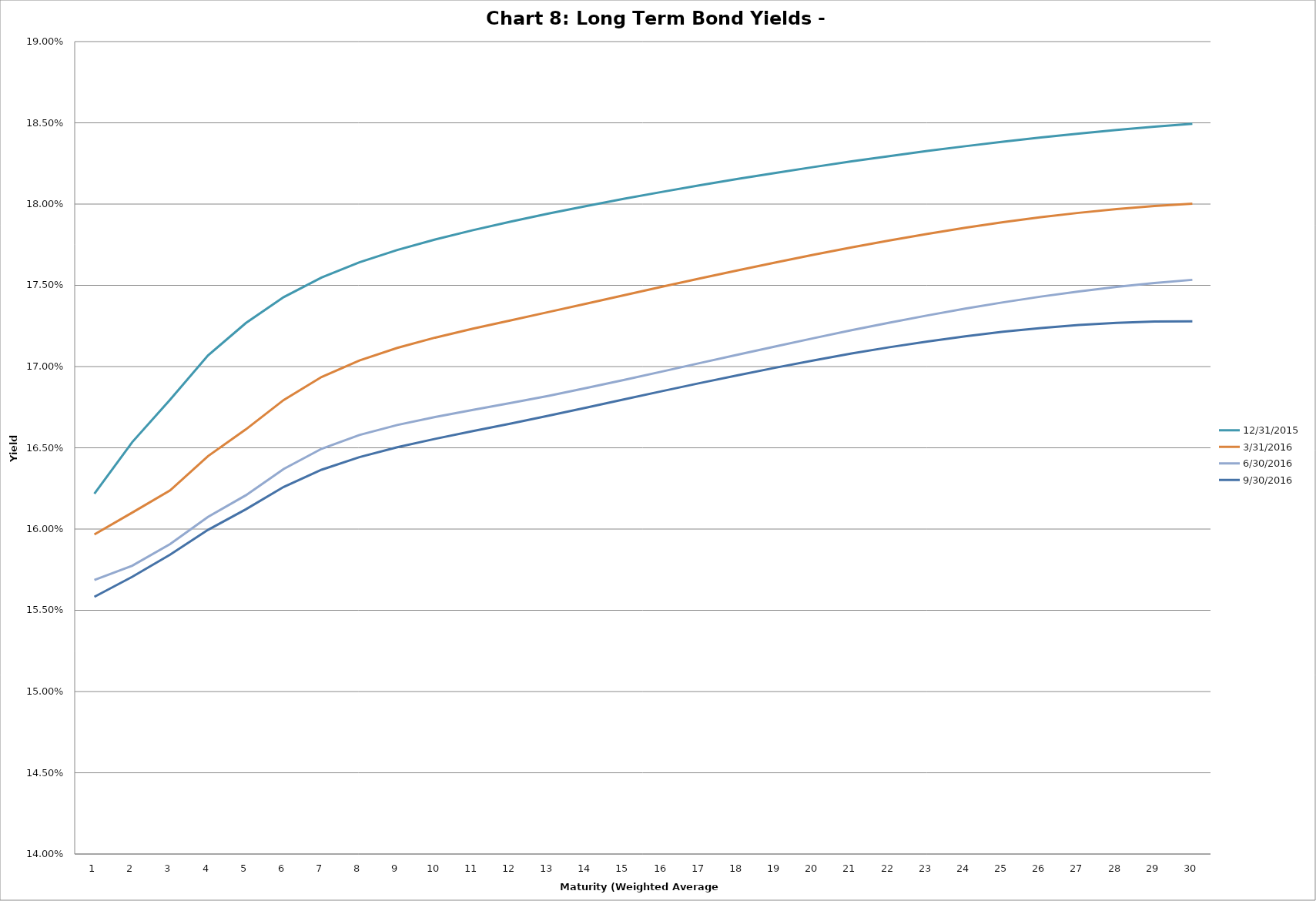
| Category | 12/31/2015 | 3/31/2016 | 6/30/2016 | 9/30/2016 |
|---|---|---|---|---|
| 0 | 0.162 | 0.16 | 0.157 | 0.156 |
| 1 | 0.165 | 0.161 | 0.158 | 0.157 |
| 2 | 0.168 | 0.162 | 0.159 | 0.158 |
| 3 | 0.171 | 0.164 | 0.161 | 0.16 |
| 4 | 0.173 | 0.166 | 0.162 | 0.161 |
| 5 | 0.174 | 0.168 | 0.164 | 0.163 |
| 6 | 0.175 | 0.169 | 0.165 | 0.164 |
| 7 | 0.176 | 0.17 | 0.166 | 0.164 |
| 8 | 0.177 | 0.171 | 0.166 | 0.165 |
| 9 | 0.178 | 0.172 | 0.167 | 0.166 |
| 10 | 0.178 | 0.172 | 0.167 | 0.166 |
| 11 | 0.179 | 0.173 | 0.168 | 0.166 |
| 12 | 0.179 | 0.173 | 0.168 | 0.167 |
| 13 | 0.18 | 0.174 | 0.169 | 0.167 |
| 14 | 0.18 | 0.174 | 0.169 | 0.168 |
| 15 | 0.181 | 0.175 | 0.17 | 0.168 |
| 16 | 0.181 | 0.175 | 0.17 | 0.169 |
| 17 | 0.182 | 0.176 | 0.171 | 0.169 |
| 18 | 0.182 | 0.176 | 0.171 | 0.17 |
| 19 | 0.182 | 0.177 | 0.172 | 0.17 |
| 20 | 0.183 | 0.177 | 0.172 | 0.171 |
| 21 | 0.183 | 0.178 | 0.173 | 0.171 |
| 22 | 0.183 | 0.178 | 0.173 | 0.172 |
| 23 | 0.184 | 0.179 | 0.174 | 0.172 |
| 24 | 0.184 | 0.179 | 0.174 | 0.172 |
| 25 | 0.184 | 0.179 | 0.174 | 0.172 |
| 26 | 0.184 | 0.179 | 0.175 | 0.173 |
| 27 | 0.185 | 0.18 | 0.175 | 0.173 |
| 28 | 0.185 | 0.18 | 0.175 | 0.173 |
| 29 | 0.185 | 0.18 | 0.175 | 0.173 |